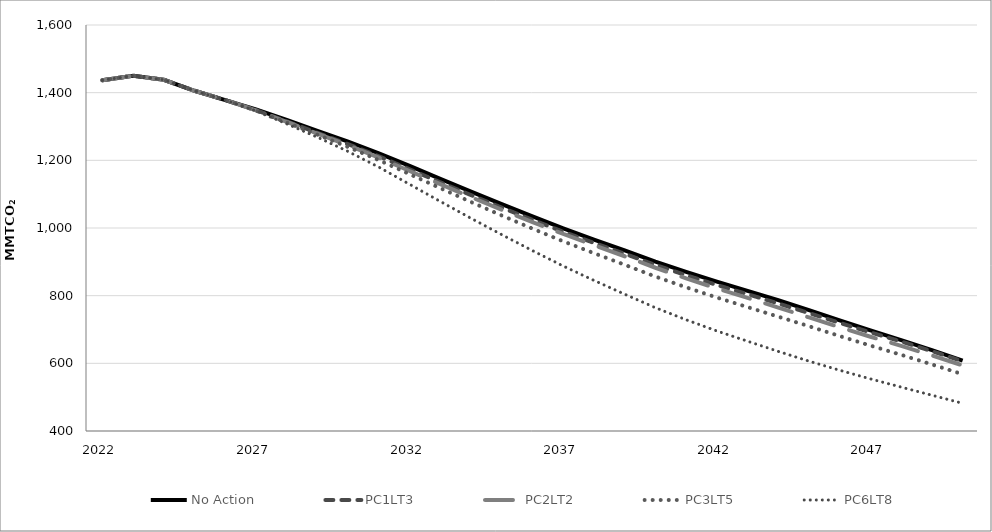
| Category | No Action | PC1LT3 | PC2LT2 | PC3LT5 | PC6LT8 |
|---|---|---|---|---|---|
| 2022.0 | 1436.757 | 1436.757 | 1436.757 | 1436.757 | 1436.757 |
| 2023.0 | 1450.133 | 1450.133 | 1450.133 | 1450.133 | 1450.133 |
| 2024.0 | 1438.015 | 1438.015 | 1438.015 | 1438.015 | 1438.015 |
| 2025.0 | 1405.595 | 1405.595 | 1405.595 | 1405.595 | 1405.595 |
| 2026.0 | 1378.201 | 1378.201 | 1378.201 | 1378.201 | 1378.201 |
| 2027.0 | 1350.345 | 1348.344 | 1347.694 | 1346.87 | 1345.947 |
| 2028.0 | 1319.186 | 1315.145 | 1313.64 | 1311.746 | 1307.847 |
| 2029.0 | 1287.335 | 1281.248 | 1278.879 | 1275.835 | 1268.211 |
| 2030.0 | 1255.016 | 1247.696 | 1244.408 | 1239.313 | 1226.146 |
| 2031.0 | 1220.561 | 1211.959 | 1207.811 | 1200.457 | 1179.789 |
| 2032.0 | 1183.349 | 1173.446 | 1168.385 | 1159.086 | 1129.157 |
| 2033.0 | 1145.247 | 1135.02 | 1129.552 | 1117.77 | 1078.487 |
| 2034.0 | 1107.354 | 1097.131 | 1091.231 | 1076.762 | 1028.623 |
| 2035.0 | 1070.324 | 1060.13 | 1053.863 | 1036.939 | 980.261 |
| 2036.0 | 1034.398 | 1024.048 | 1017.624 | 998.075 | 933.045 |
| 2037.0 | 999.132 | 988.897 | 982.32 | 960.602 | 887.534 |
| 2038.0 | 965.859 | 955.987 | 949.469 | 925.632 | 845.07 |
| 2039.0 | 933.605 | 923.824 | 916.517 | 891.308 | 804.344 |
| 2040.0 | 900.773 | 890.665 | 882.524 | 856.441 | 764.41 |
| 2041.0 | 870.56 | 860.487 | 851.07 | 824.711 | 728.724 |
| 2042.0 | 841.714 | 831.652 | 821.336 | 794.481 | 695.639 |
| 2043.0 | 814.258 | 804.421 | 793.355 | 766.225 | 665.394 |
| 2044.0 | 786.663 | 776.923 | 764.78 | 737.918 | 635.226 |
| 2045.0 | 757.102 | 748.471 | 735.718 | 709.656 | 606.396 |
| 2046.0 | 726.731 | 719.567 | 706.779 | 680.562 | 579.506 |
| 2047.0 | 697.172 | 691.495 | 678.631 | 652.402 | 553.962 |
| 2048.0 | 668.744 | 664.508 | 651.649 | 625.116 | 529.696 |
| 2049.0 | 638.862 | 635.883 | 623.181 | 596.738 | 505.712 |
| 2050.0 | 608.103 | 606.14 | 593.898 | 567.723 | 481.895 |